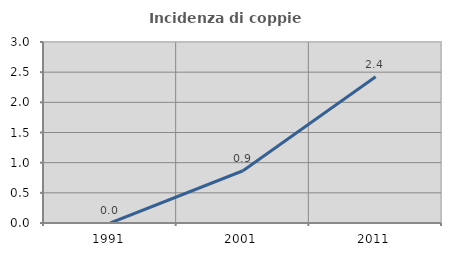
| Category | Incidenza di coppie miste |
|---|---|
| 1991.0 | 0 |
| 2001.0 | 0.866 |
| 2011.0 | 2.423 |